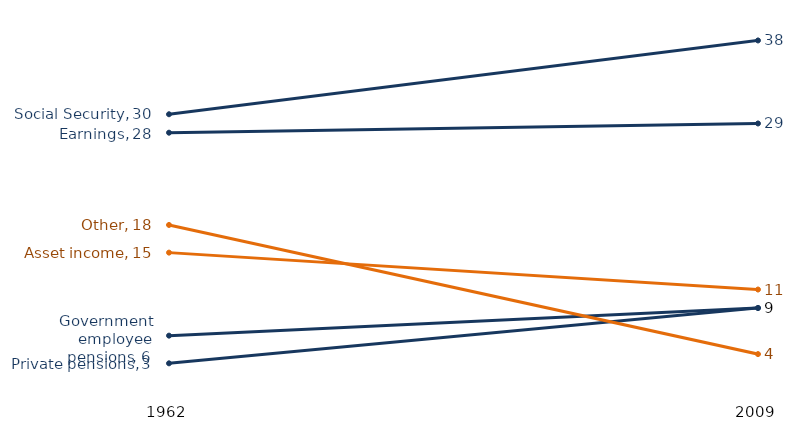
| Category | Social Security | Earnings | Asset income | Private pensions | Government employee pensions | Other |
|---|---|---|---|---|---|---|
| 1962.0 | 30 | 28 | 15 | 3 | 6 | 18 |
| 2009.0 | 38 | 29 | 11 | 9 | 9 | 4 |